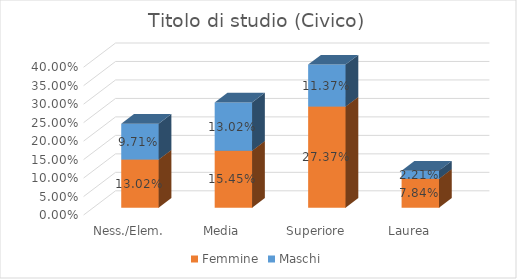
| Category | Femmine | Maschi |
|---|---|---|
| Ness./Elem. | 0.13 | 0.097 |
| Media | 0.155 | 0.13 |
| Superiore | 0.274 | 0.114 |
| Laurea | 0.078 | 0.022 |